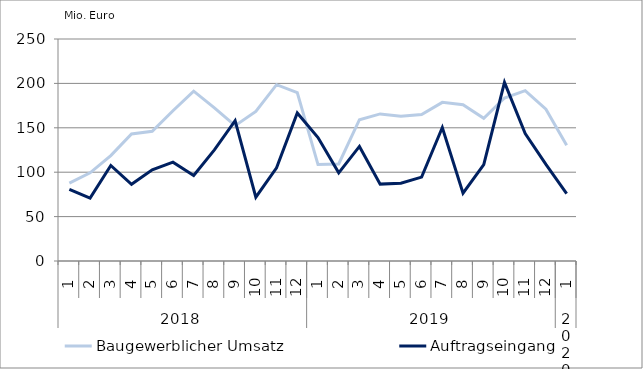
| Category | Baugewerblicher Umsatz | Auftragseingang |
|---|---|---|
| 0 | 87640.529 | 80684.627 |
| 1 | 99259.455 | 70746.763 |
| 2 | 118764.324 | 107538.747 |
| 3 | 143144.178 | 86374.619 |
| 4 | 146070.782 | 102661.329 |
| 5 | 169150.753 | 111287.709 |
| 6 | 191277.885 | 96286.662 |
| 7 | 172425.535 | 125142.495 |
| 8 | 152354.98 | 158112.302 |
| 9 | 168372.756 | 71808.619 |
| 10 | 198558.472 | 104904.147 |
| 11 | 189665.914 | 166653.461 |
| 12 | 108616.605 | 139065.287 |
| 13 | 109331.58 | 99318.609 |
| 14 | 159117.81 | 129002.041 |
| 15 | 165654.287 | 86579.2 |
| 16 | 162976.056 | 87644.362 |
| 17 | 165026.188 | 94463.186 |
| 18 | 178622.938 | 150345.08 |
| 19 | 176074.101 | 76434.317 |
| 20 | 160663.041 | 108444.162 |
| 21 | 183589.485 | 201122.697 |
| 22 | 191777.213 | 143514.792 |
| 23 | 170885.223 | 108780.022 |
| 24 | 130445.562 | 75891.481 |